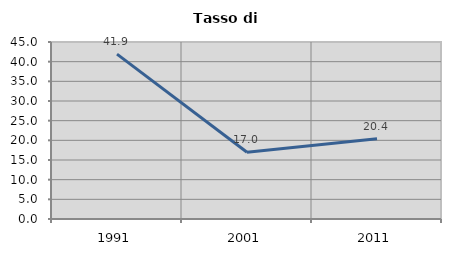
| Category | Tasso di disoccupazione   |
|---|---|
| 1991.0 | 41.929 |
| 2001.0 | 16.984 |
| 2011.0 | 20.399 |